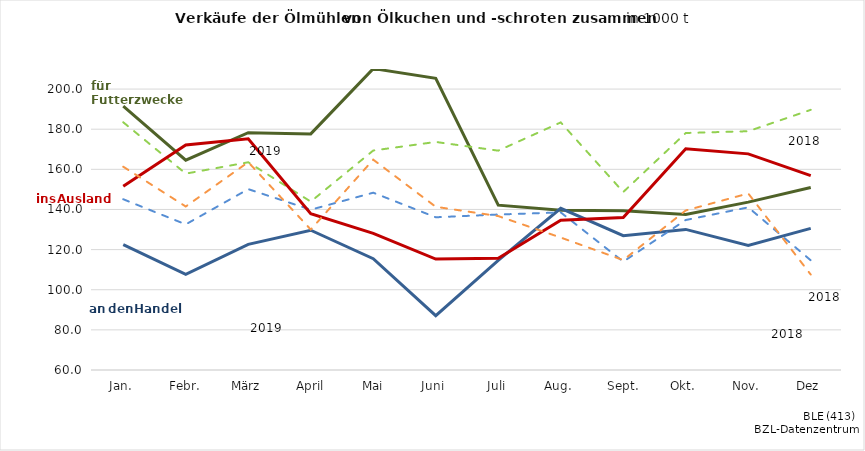
| Category | Futter19 | Futter18 | Handel19 | Handel18 | Ausland19 | Ausland18 |
|---|---|---|---|---|---|---|
| Jan. | 191.453 | 183.45 | 122.455 | 145.096 | 151.573 | 161.312 |
|  Febr. | 164.562 | 157.861 | 107.67 | 132.569 | 172.135 | 141.477 |
| März | 178.267 | 163.52 | 122.595 | 150.129 | 175.238 | 163.578 |
|  April | 177.657 | 143.921 | 129.651 | 139.88 | 137.886 | 129.994 |
|  Mai | 210.183 | 169.38 | 115.46 | 148.36 | 128.121 | 164.815 |
| Juni | 205.379 | 173.649 | 87.104 | 136.109 | 115.286 | 141.331 |
| Juli | 142.162 | 169.304 | 114.678 | 137.481 | 115.678 | 136.703 |
| Aug. | 139.668 | 183.384 | 140.567 | 138.534 | 134.671 | 126.001 |
|  Sept. | 139.421 | 148.692 | 126.916 | 113.998 | 135.975 | 114.768 |
| Okt. | 137.485 | 178.106 | 130.068 | 134.753 | 170.252 | 139.506 |
| Nov. | 143.664 | 178.991 | 122.055 | 141.045 | 167.706 | 147.968 |
| Dez | 150.936 | 189.644 | 130.603 | 114.654 | 156.879 | 107.552 |